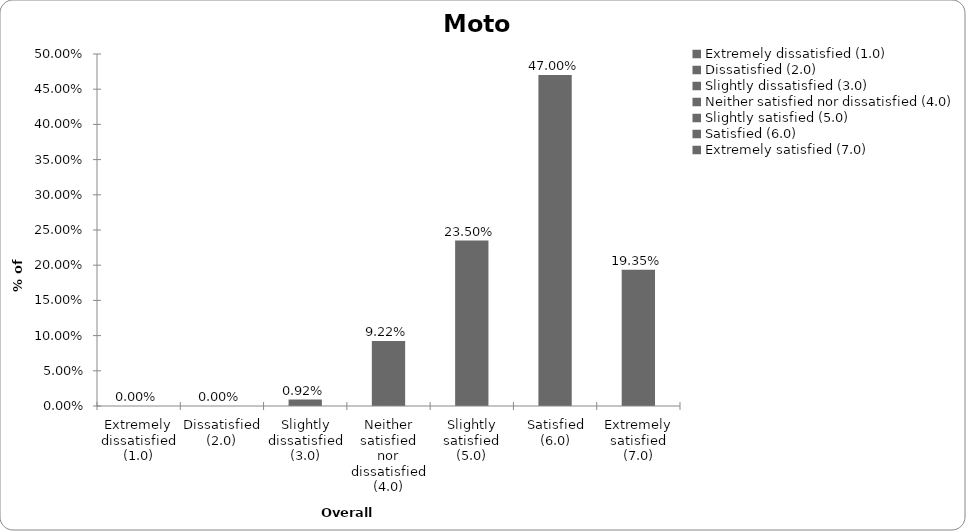
| Category | Motor |
|---|---|
| Extremely dissatisfied (1.0) | 0 |
| Dissatisfied (2.0) | 0 |
| Slightly dissatisfied (3.0) | 0.009 |
| Neither satisfied nor dissatisfied (4.0) | 0.092 |
| Slightly satisfied (5.0) | 0.235 |
| Satisfied (6.0) | 0.47 |
| Extremely satisfied (7.0) | 0.194 |